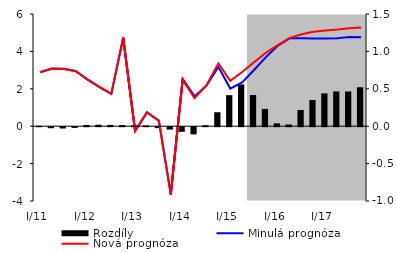
| Category | Rozdíly |
|---|---|
| I/11 | 0.005 |
| II | -0.013 |
| III | -0.017 |
| IV | -0.009 |
| I/12 | 0.016 |
| II | 0.02 |
| III | 0.017 |
| IV | 0.015 |
| I/13 | 0.011 |
| II | 0.011 |
| III | -0.012 |
| IV | -0.031 |
| I/14 | -0.061 |
| II | -0.096 |
| III | 0.013 |
| IV | 0.187 |
| I/15 | 0.415 |
| II | 0.559 |
| III | 0.417 |
| IV | 0.231 |
| I/16 | 0.038 |
| II | 0.023 |
| III | 0.217 |
| IV | 0.35 |
| I/17 | 0.439 |
| II | 0.465 |
| III | 0.465 |
| IV | 0.521 |